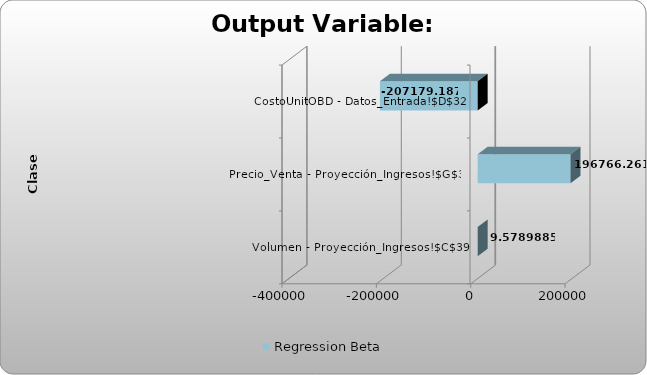
| Category | Regression Beta |
|---|---|
| Volumen - Proyección_Ingresos!$C$39 | 9.579 |
| Precio_Venta - Proyección_Ingresos!$G$39 | 196766.261 |
| CostoUnitOBD - Datos_Entrada!$D$32 | -207179.187 |